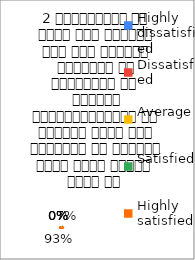
| Category | 2 व्याख्यान से रूचि में वृद्धि हुई एवं शिक्षण जानकारी से परिपूर्ण था 
शिक्षक विद्यार्थियों के द्वारा पूछे गये प्रश्नो का समाधान करने हेतु तत्पर  रहते है  |
|---|---|
| Highly dissatisfied | 0 |
| Dissatisfied | 0 |
| Average | 0 |
| Satisfied | 1 |
| Highly satisfied | 14 |